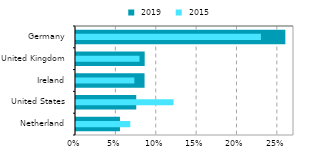
| Category |  2019 |
|---|---|
| Netherland | 0.054 |
| United States | 0.075 |
| Ireland | 0.085 |
| United Kingdom | 0.085 |
| Germany | 0.259 |